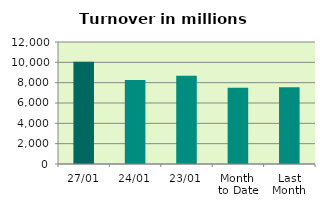
| Category | Series 0 |
|---|---|
| 27/01 | 10068.9 |
| 24/01 | 8271.246 |
| 23/01 | 8675.199 |
| Month 
to Date | 7489.099 |
| Last
Month | 7540.813 |